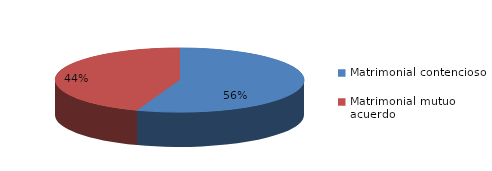
| Category | Series 0 |
|---|---|
| 0 | 431 |
| 1 | 345 |